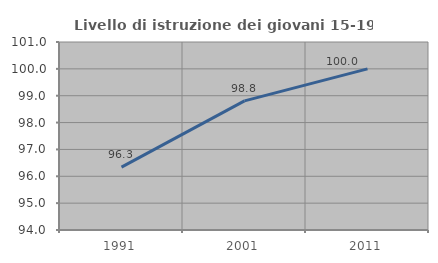
| Category | Livello di istruzione dei giovani 15-19 anni |
|---|---|
| 1991.0 | 96.341 |
| 2001.0 | 98.81 |
| 2011.0 | 100 |